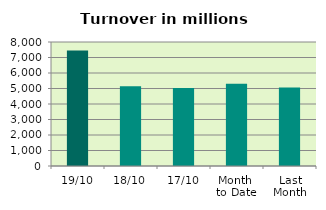
| Category | Series 0 |
|---|---|
| 19/10 | 7454.277 |
| 18/10 | 5146.406 |
| 17/10 | 5032.407 |
| Month 
to Date | 5310.403 |
| Last
Month | 5068.328 |